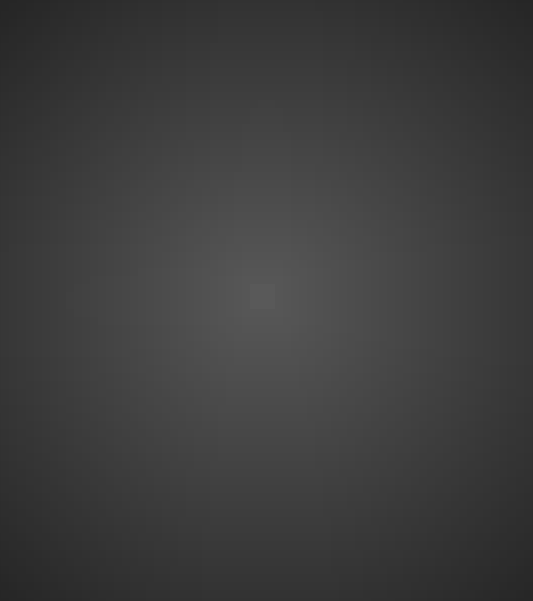
| Category | Series 0 |
|---|---|
| SPY | 0 |
| VBR | 0 |
| VNQ | 0 |
| TLT | 0 |